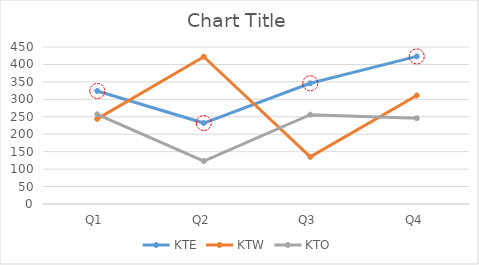
| Category | KTE | KTW | KTO | Series 3 |
|---|---|---|---|---|
| Q1 | 324 | 244 | 257 | 324 |
| Q2 | 232 | 422 | 123 | 232 |
| Q3 | 346 | 135 | 256 | 346 |
| Q4 | 423 | 311 | 246 | 423 |